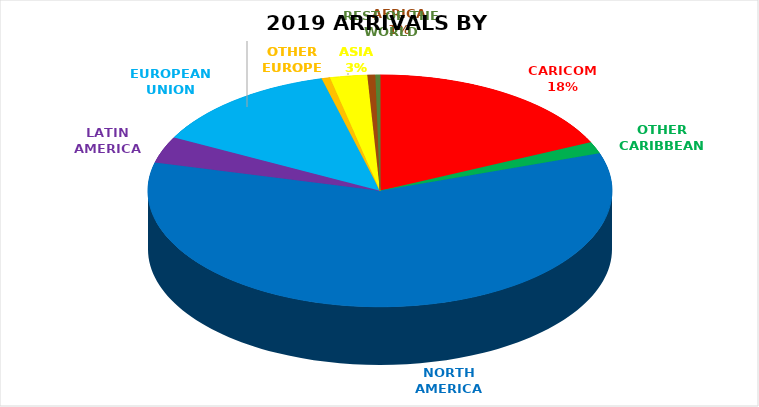
| Category | Series 0 |
|---|---|
| CARICOM  | 70340 |
| OTHER CARIBBEAN | 6368 |
| NORTH AMERICA | 230011 |
| LATIN AMERICA | 14363 |
| EUROPEAN UNION | 51788 |
| OTHER EUROPE | 2262 |
| ASIA | 10059 |
| AFRICA | 2142 |
| REST OF THE WORLD | 1243 |